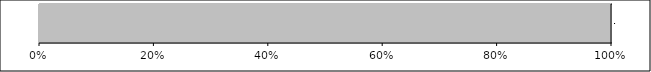
| Category | Series 0 | Series 1 | Series 2 | Series 3 | Series 4 |
|---|---|---|---|---|---|
| 0 | 0 | 0 | 0 | 0 | 4 |